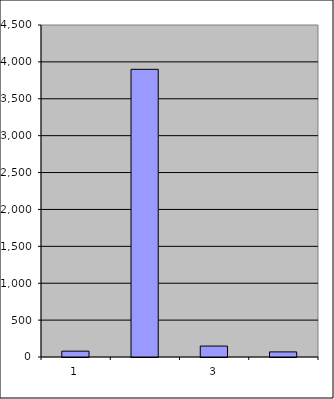
| Category | Series 0 |
|---|---|
| 0 | 79 |
| 1 | 3899.16 |
| 2 | 148.188 |
| 3 | 69.196 |